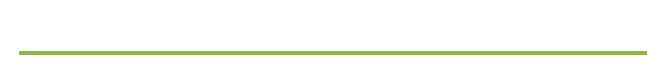
| Category | Waste |
|---|---|
| 0 | 0 |